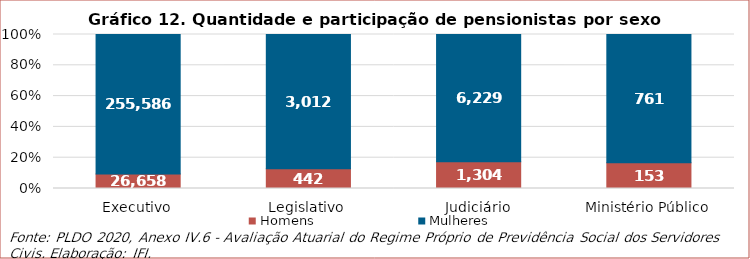
| Category | Homens | Mulheres |
|---|---|---|
| Executivo | 26658 | 255586 |
| Legislativo | 442 | 3012 |
| Judiciário | 1304 | 6229 |
| Ministério Público | 153 | 761 |